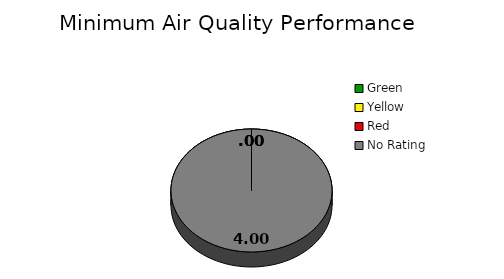
| Category | Counts |
|---|---|
| Green | 0 |
| Yellow | 0 |
| Red | 0 |
| No Rating | 4 |